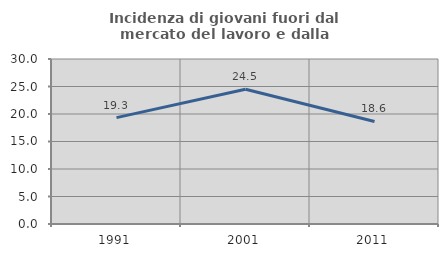
| Category | Incidenza di giovani fuori dal mercato del lavoro e dalla formazione  |
|---|---|
| 1991.0 | 19.346 |
| 2001.0 | 24.502 |
| 2011.0 | 18.64 |